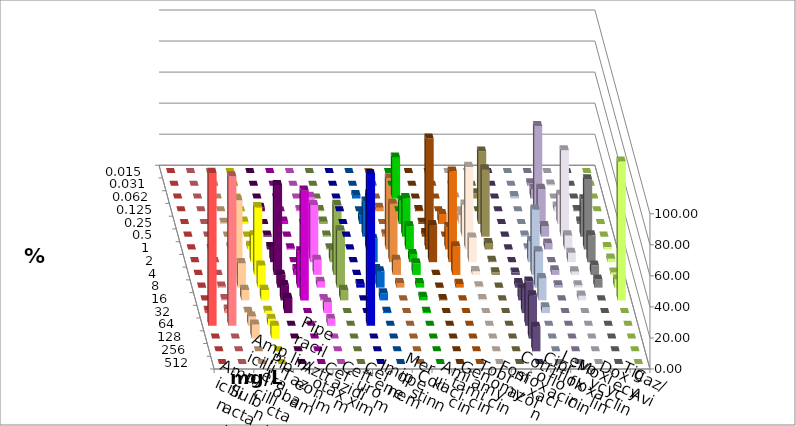
| Category | Ampicillin | Ampicillin/ Sulbactam | Piperacillin | Piperacillin/ Tazobactam | Aztreonam | Cefotaxim | Ceftazidim | Cefuroxim | Imipenem | Meropenem | Colistin | Amikacin | Gentamicin | Tobramycin | Fosfomycin | Cotrimoxazol | Ciprofloxacin | Levofloxacin | Moxifloxacin | Doxycyclin | Tigecyclin | Caz/Avi |
|---|---|---|---|---|---|---|---|---|---|---|---|---|---|---|---|---|---|---|---|---|---|---|
| 0.015 | 0 | 0 | 0 | 0 | 0 | 0 | 0 | 0 | 0 | 0 | 0 | 0 | 0 | 0 | 0 | 0 | 0 | 0 | 0 | 0 | 0 | 0 |
| 0.031 | 0 | 0 | 0 | 0 | 0 | 0 | 0 | 0 | 0 | 0 | 0 | 0 | 0 | 0 | 0 | 0 | 1.504 | 0.752 | 0 | 0 | 0 | 0 |
| 0.062 | 0 | 0 | 0 | 0 | 0 | 0 | 0 | 0 | 2.256 | 26.316 | 0 | 0 | 0.794 | 3.333 | 0 | 1.504 | 6.015 | 0 | 0 | 0 | 0 | 0 |
| 0.125 | 0 | 0 | 0 | 0 | 2.256 | 0 | 0.752 | 0 | 0 | 0 | 0.794 | 0 | 0 | 0 | 0 | 0 | 54.887 | 3.008 | 0.752 | 0 | 0.752 | 2.256 |
| 0.25 | 0 | 0 | 0.752 | 1.504 | 0 | 1.504 | 0 | 0 | 5.263 | 15.038 | 0.794 | 6.4 | 5.556 | 46.667 | 0 | 0 | 22.556 | 18.797 | 1.504 | 0 | 1.504 | 0 |
| 0.5 | 0 | 0 | 0 | 0 | 0.752 | 0 | 3.008 | 0 | 22.556 | 24.812 | 2.381 | 0 | 20.635 | 43.333 | 0 | 0.752 | 6.767 | 55.639 | 24.06 | 0 | 0.752 | 1.504 |
| 1.0 | 0 | 0 | 1.504 | 2.256 | 1.504 | 0.752 | 33.835 | 0 | 35.338 | 15.038 | 71.429 | 14.4 | 53.175 | 4.167 | 0 | 0.752 | 3.759 | 9.023 | 45.113 | 1.504 | 0.752 | 45.865 |
| 2.0 | 0 | 0 | 11.278 | 17.293 | 9.774 | 0 | 36.842 | 0 | 15.038 | 5.263 | 23.81 | 58.4 | 15.873 | 0.833 | 0 | 13.534 | 0 | 6.015 | 17.293 | 2.256 | 7.519 | 37.594 |
| 4.0 | 0 | 0 | 48.12 | 43.609 | 57.895 | 3.759 | 9.774 | 0 | 3.759 | 7.519 | 0 | 18.4 | 2.381 | 1.667 | 1.504 | 42.105 | 3.008 | 2.256 | 6.015 | 1.504 | 45.113 | 9.774 |
| 8.0 | 0 | 0.752 | 15.789 | 14.286 | 8.271 | 23.308 | 3.759 | 2.256 | 10.526 | 3.008 | 0 | 2.4 | 0.794 | 0 | 3.008 | 23.308 | 1.504 | 1.504 | 5.263 | 5.263 | 36.842 | 3.008 |
| 16.0 | 0 | 0.752 | 6.767 | 6.767 | 9.774 | 70.677 | 0.752 | 0 | 4.511 | 2.256 | 0.794 | 0 | 0.794 | 0 | 7.519 | 14.286 | 0 | 3.008 | 0 | 89.474 | 6.767 | 0 |
| 32.0 | 1.504 | 2.256 | 0.752 | 1.504 | 9.774 | 0 | 6.767 | 0 | 0.752 | 0.752 | 0 | 0 | 0 | 0 | 15.789 | 3.759 | 0 | 0 | 0 | 0 | 0 | 0 |
| 64.0 | 98.496 | 96.241 | 6.015 | 4.511 | 0 | 0 | 4.511 | 97.744 | 0 | 0 | 0 | 0 | 0 | 0 | 28.571 | 0 | 0 | 0 | 0 | 0 | 0 | 0 |
| 128.0 | 0 | 0 | 9.023 | 8.271 | 0 | 0 | 0 | 0 | 0 | 0 | 0 | 0 | 0 | 0 | 27.82 | 0 | 0 | 0 | 0 | 0 | 0 | 0 |
| 256.0 | 0 | 0 | 0 | 0 | 0 | 0 | 0 | 0 | 0 | 0 | 0 | 0 | 0 | 0 | 15.789 | 0 | 0 | 0 | 0 | 0 | 0 | 0 |
| 512.0 | 0 | 0 | 0 | 0 | 0 | 0 | 0 | 0 | 0 | 0 | 0 | 0 | 0 | 0 | 0 | 0 | 0 | 0 | 0 | 0 | 0 | 0 |